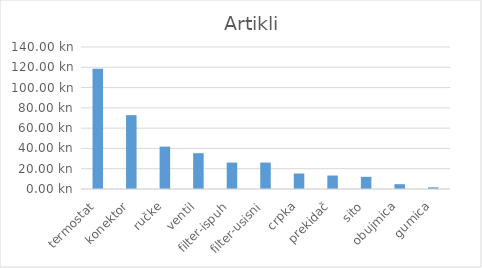
| Category | Series 0 |
|---|---|
| termostat | 118.59 |
| konektor | 72.83 |
| ručke | 41.8 |
| ventil | 35.31 |
| filter-ispuh | 26.05 |
| filter-usisni | 26.05 |
| crpka | 15.26 |
| prekidač | 13.29 |
| sito | 12 |
| obujmica | 4.75 |
| gumica | 1.63 |